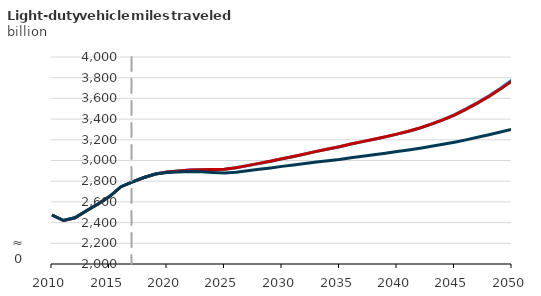
| Category | Autonomous battery electric vehicle | Autonomous hybrid electric vehicle  | Reference |
|---|---|---|---|
| 2010.0 | 2473.532 | 2473.532 | 2473.532 |
| 2011.0 | 2420.437 | 2420.437 | 2420.437 |
| 2012.0 | 2446.88 | 2446.88 | 2446.88 |
| 2013.0 | 2514.818 | 2514.818 | 2514.818 |
| 2014.0 | 2579.422 | 2579.422 | 2579.422 |
| 2015.0 | 2650.869 | 2650.869 | 2650.869 |
| 2016.0 | 2746.855 | 2746.855 | 2746.855 |
| 2017.0 | 2794.449 | 2794.449 | 2794.468 |
| 2018.0 | 2835.766 | 2835.882 | 2835.553 |
| 2019.0 | 2868.791 | 2868.87 | 2868.701 |
| 2020.0 | 2889.384 | 2889.51 | 2884.851 |
| 2021.0 | 2899.688 | 2899.63 | 2889.816 |
| 2022.0 | 2908.982 | 2909.135 | 2893.207 |
| 2023.0 | 2910.91 | 2911.207 | 2890.78 |
| 2024.0 | 2911.868 | 2912.177 | 2884.097 |
| 2025.0 | 2914.799 | 2914.924 | 2879.079 |
| 2026.0 | 2930.84 | 2930.903 | 2887.568 |
| 2027.0 | 2950.538 | 2950.629 | 2900.151 |
| 2028.0 | 2971.891 | 2972.044 | 2914.481 |
| 2029.0 | 2993.455 | 2993.483 | 2928.413 |
| 2030.0 | 3016.384 | 3016.344 | 2943.118 |
| 2031.0 | 3039.058 | 3039.072 | 2956.83 |
| 2032.0 | 3063.717 | 3063.573 | 2971.411 |
| 2033.0 | 3087.97 | 3087.952 | 2985.053 |
| 2034.0 | 3111.351 | 3111.239 | 2997.822 |
| 2035.0 | 3133.056 | 3133.074 | 3009.571 |
| 2036.0 | 3159.09 | 3159.171 | 3026.684 |
| 2037.0 | 3182.47 | 3182.578 | 3041.128 |
| 2038.0 | 3204.902 | 3205.098 | 3055.17 |
| 2039.0 | 3228.504 | 3228.718 | 3070.143 |
| 2040.0 | 3254.56 | 3254.622 | 3086.223 |
| 2041.0 | 3282.913 | 3282.472 | 3102.139 |
| 2042.0 | 3315.771 | 3314.491 | 3119.272 |
| 2043.0 | 3352.868 | 3350.782 | 3137.062 |
| 2044.0 | 3395.319 | 3392.296 | 3156.134 |
| 2045.0 | 3443.5 | 3439.345 | 3176.605 |
| 2046.0 | 3498.834 | 3493.441 | 3199.551 |
| 2047.0 | 3560.498 | 3554.029 | 3224.192 |
| 2048.0 | 3626.288 | 3618.582 | 3248.851 |
| 2049.0 | 3698.51 | 3689.585 | 3274.65 |
| 2050.0 | 3777.893 | 3767.346 | 3302.436 |